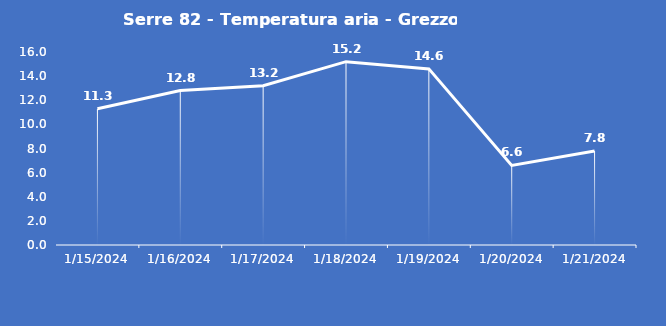
| Category | Serre 82 - Temperatura aria - Grezzo (°C) |
|---|---|
| 1/15/24 | 11.3 |
| 1/16/24 | 12.8 |
| 1/17/24 | 13.2 |
| 1/18/24 | 15.2 |
| 1/19/24 | 14.6 |
| 1/20/24 | 6.6 |
| 1/21/24 | 7.8 |